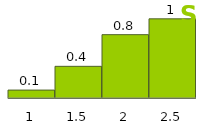
| Category | Series 1 |
|---|---|
| 1.0 | 0.1 |
| 1.5 | 0.4 |
| 2.0 | 0.8 |
| 2.5 | 1 |